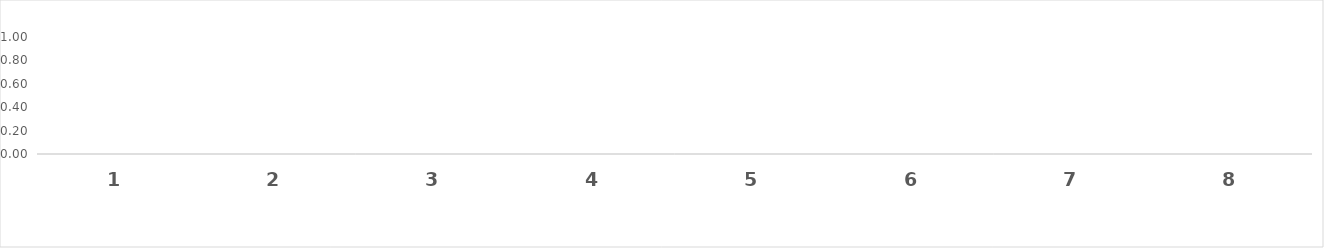
| Category | Series 1 |
|---|---|
| 0 | 0 |
| 1 | 0 |
| 2 | 0 |
| 3 | 0 |
| 4 | 0 |
| 5 | 0 |
| 6 | 0 |
| 7 | 0 |